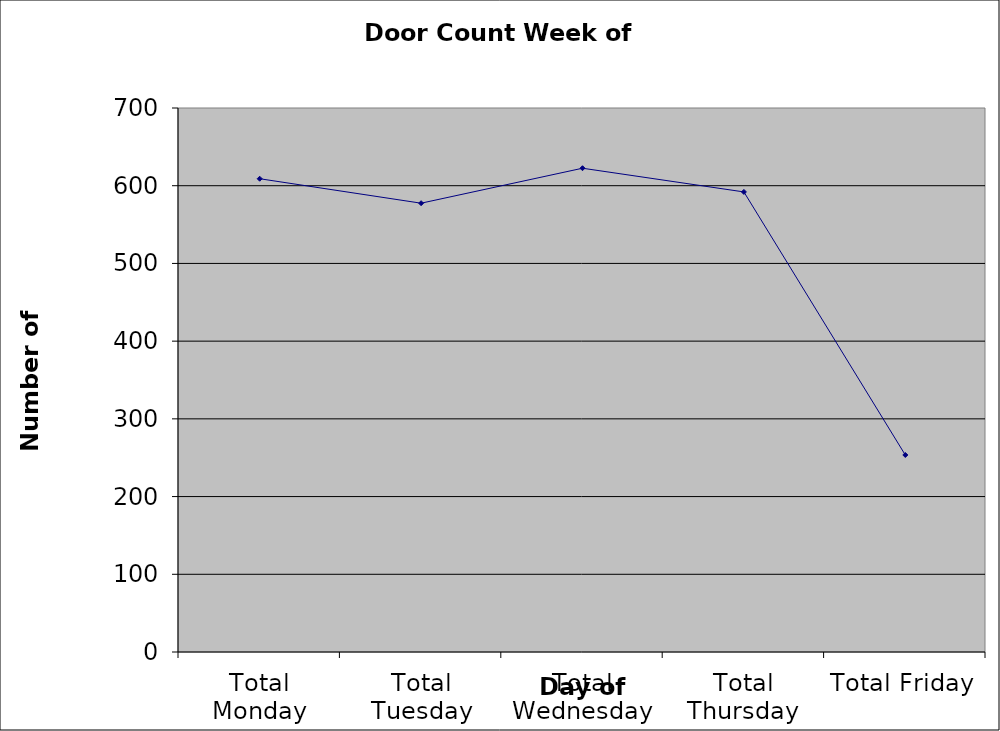
| Category | Series 0 |
|---|---|
| Total Monday | 609 |
| Total Tuesday | 577.5 |
| Total Wednesday | 622.5 |
| Total Thursday | 592 |
| Total Friday | 253.5 |